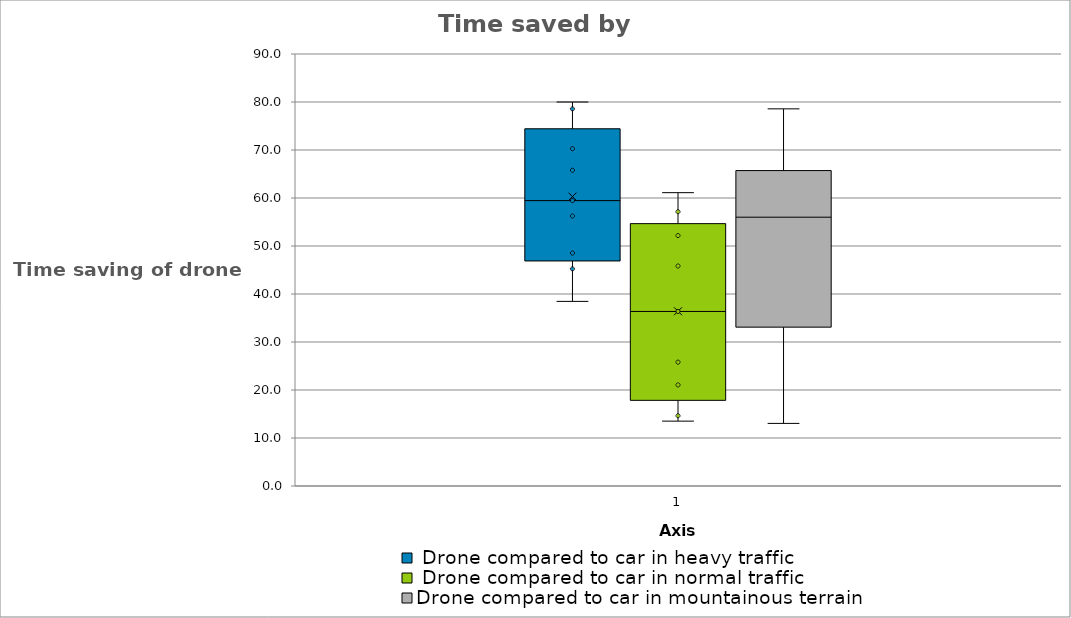
| Category | Drone | Car normal traffic | Car heavy traffic |
|---|---|---|---|
| Route 1 | 3 | 7 | 14 |
| Route 2 | 7 | 18 | 35 |
| Route 3 | 11 | 23 | 37 |
| Route 4 | 13 | 24 | 38 |
| Route 5 | 14 | 22 | 32 |
| Route 6 | 15 | 19 | 37 |
| Route 7 | 23 | 31 | 42 |
| Route 8 | 32 | 37 | 52 |
| Route 9 | 35 | 41 | 68 |